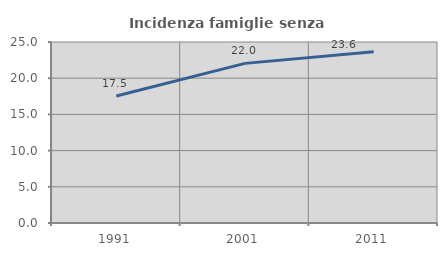
| Category | Incidenza famiglie senza nuclei |
|---|---|
| 1991.0 | 17.541 |
| 2001.0 | 22.048 |
| 2011.0 | 23.64 |